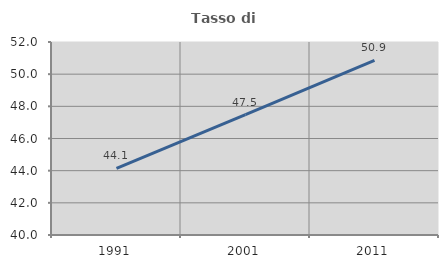
| Category | Tasso di occupazione   |
|---|---|
| 1991.0 | 44.146 |
| 2001.0 | 47.488 |
| 2011.0 | 50.863 |